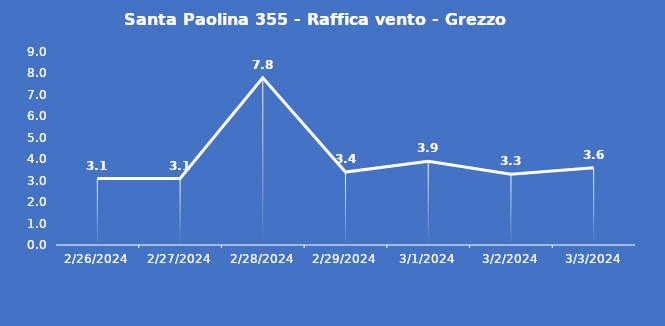
| Category | Santa Paolina 355 - Raffica vento - Grezzo (m/s) |
|---|---|
| 2/26/24 | 3.1 |
| 2/27/24 | 3.1 |
| 2/28/24 | 7.8 |
| 2/29/24 | 3.4 |
| 3/1/24 | 3.9 |
| 3/2/24 | 3.3 |
| 3/3/24 | 3.6 |